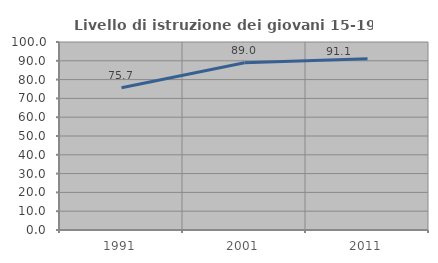
| Category | Livello di istruzione dei giovani 15-19 anni |
|---|---|
| 1991.0 | 75.698 |
| 2001.0 | 88.987 |
| 2011.0 | 91.121 |